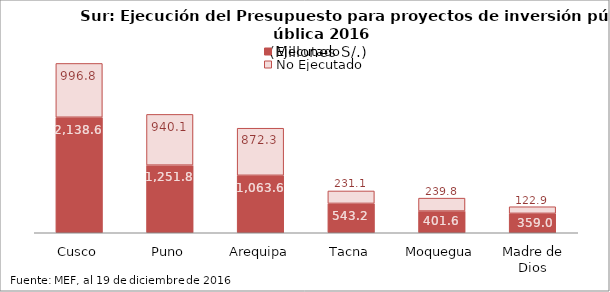
| Category | Ejecutado | No Ejecutado |
|---|---|---|
| Cusco | 2138.623 | 996.795 |
| Puno | 1251.801 | 940.129 |
| Arequipa | 1063.585 | 872.274 |
| Tacna | 543.161 | 231.061 |
| Moquegua | 401.64 | 239.757 |
| Madre de Dios | 359.022 | 122.929 |